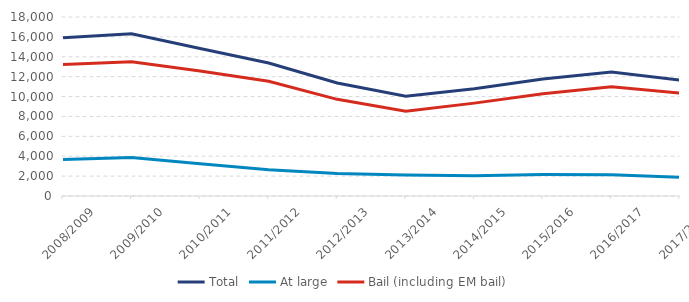
| Category | Total | At large | Bail (including EM bail) |
|---|---|---|---|
| 2008/2009 | 15913 | 3682 | 13228 |
| 2009/2010 | 16323 | 3875 | 13491 |
| 2010/2011 | 14839 | 3233 | 12572 |
| 2011/2012 | 13378 | 2632 | 11532 |
| 2012/2013 | 11371 | 2264 | 9720 |
| 2013/2014 | 10037 | 2115 | 8517 |
| 2014/2015 | 10795 | 2031 | 9339 |
| 2015/2016 | 11773 | 2155 | 10278 |
| 2016/2017 | 12467 | 2143 | 10974 |
| 2017/2018 | 11647 | 1874 | 10349 |